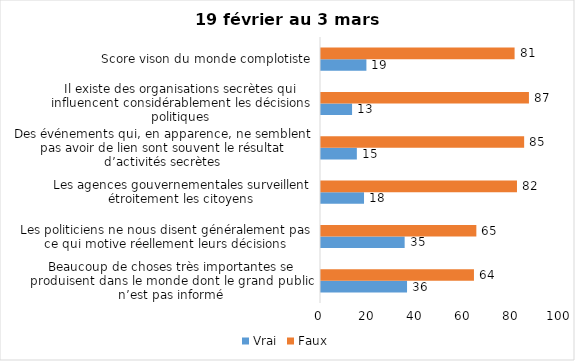
| Category | Vrai | Faux |
|---|---|---|
| Beaucoup de choses très importantes se produisent dans le monde dont le grand public n’est pas informé | 36 | 64 |
| Les politiciens ne nous disent généralement pas ce qui motive réellement leurs décisions | 35 | 65 |
| Les agences gouvernementales surveillent étroitement les citoyens | 18 | 82 |
| Des événements qui, en apparence, ne semblent pas avoir de lien sont souvent le résultat d’activités secrètes | 15 | 85 |
| Il existe des organisations secrètes qui influencent considérablement les décisions politiques | 13 | 87 |
| Score vison du monde complotiste | 19 | 81 |